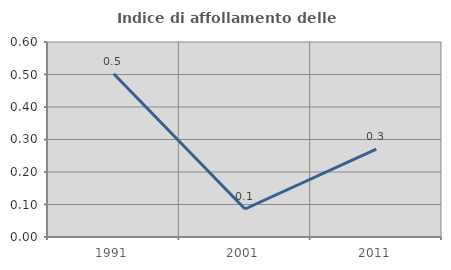
| Category | Indice di affollamento delle abitazioni  |
|---|---|
| 1991.0 | 0.503 |
| 2001.0 | 0.086 |
| 2011.0 | 0.27 |